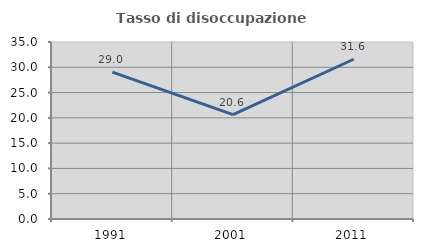
| Category | Tasso di disoccupazione giovanile  |
|---|---|
| 1991.0 | 29.044 |
| 2001.0 | 20.641 |
| 2011.0 | 31.588 |